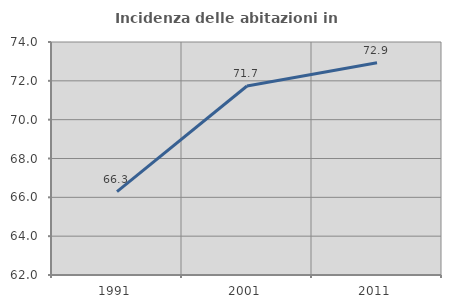
| Category | Incidenza delle abitazioni in proprietà  |
|---|---|
| 1991.0 | 66.296 |
| 2001.0 | 71.733 |
| 2011.0 | 72.93 |